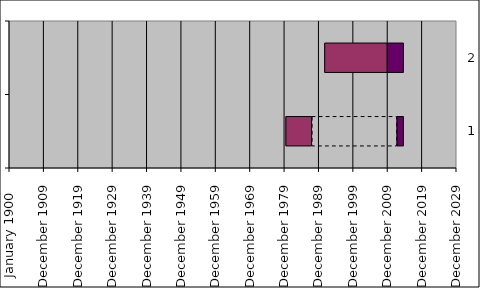
| Category | Début | Fin | Gap | 2 |
|---|---|---|---|---|
| 0 | 15/05/1980 | 2786 | 9023 | 731 |
| 1 | 01/09/1991 | 6675 | 0 | 1739 |